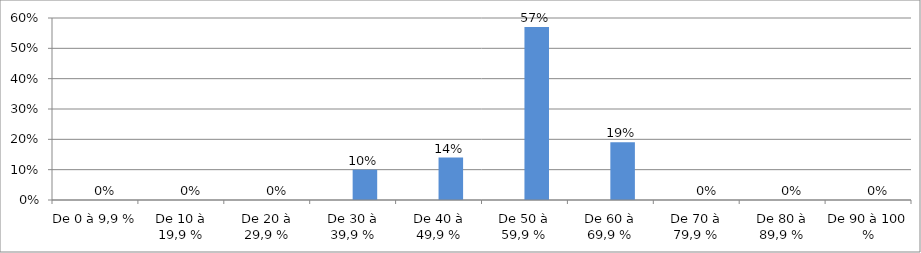
| Category | Series 0 | Series 1 |
|---|---|---|
| De 0 à 9,9 % |  | 0 |
| De 10 à 19,9 % |  | 0 |
| De 20 à 29,9 % |  | 0 |
| De 30 à 39,9 % |  | 0.1 |
| De 40 à 49,9 % |  | 0.14 |
| De 50 à 59,9 % |  | 0.57 |
| De 60 à 69,9 % |  | 0.19 |
| De 70 à 79,9 % |  | 0 |
| De 80 à 89,9 % |  | 0 |
| De 90 à 100 % |  | 0 |